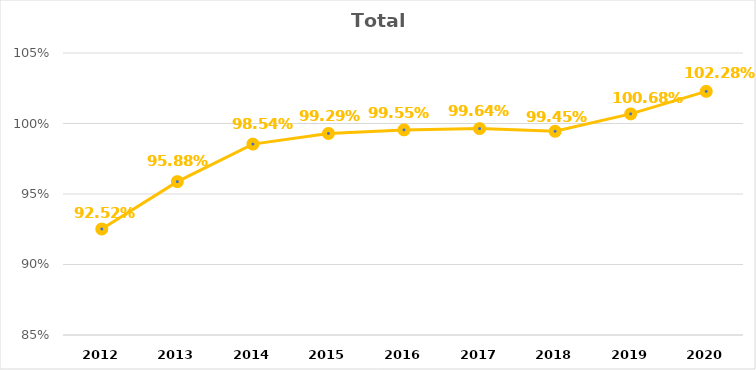
| Category | Total |
|---|---|
| 2012.0 | 0.925 |
| 2013.0 | 0.959 |
| 2014.0 | 0.985 |
| 2015.0 | 0.993 |
| 2016.0 | 0.995 |
| 2017.0 | 0.996 |
| 2018.0 | 0.994 |
| 2019.0 | 1.007 |
| 2020.0 | 1.023 |